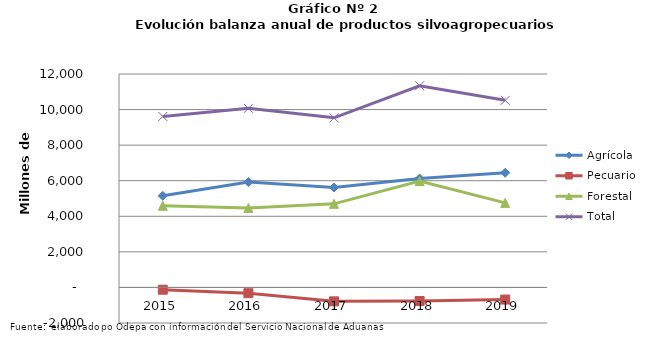
| Category | Agrícola | Pecuario | Forestal | Total |
|---|---|---|---|---|
| 2015.0 | 5149872 | -127785 | 4591408 | 9613495 |
| 2016.0 | 5924661 | -325421 | 4468104 | 10067344 |
| 2017.0 | 5619304 | -782654 | 4700192 | 9536842 |
| 2018.0 | 6126434 | -761998 | 5976134 | 11340570 |
| 2019.0 | 6445361 | -681747 | 4754664 | 10518278 |